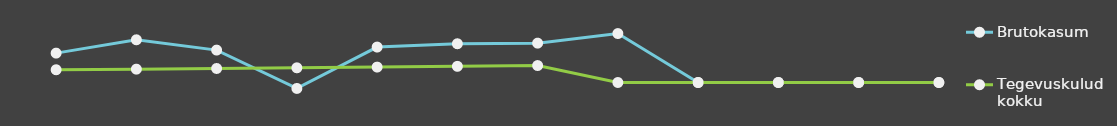
| Category | Brutokasum | Tegevuskulud kokku |
|---|---|---|
| 0 | 25000 | 10841 |
| 1 | 36348 | 11367.25 |
| 2 | 27562 | 11919.82 |
| 3 | -5059.5 | 12500.01 |
| 4 | 30153.18 | 13109.21 |
| 5 | 32964.45 | 13748.86 |
| 6 | 33502.87 | 14420.51 |
| 7 | 41646 | 0 |
| 8 | 0 | 0 |
| 9 | 0 | 0 |
| 10 | 0 | 0 |
| 11 | 0 | 0 |